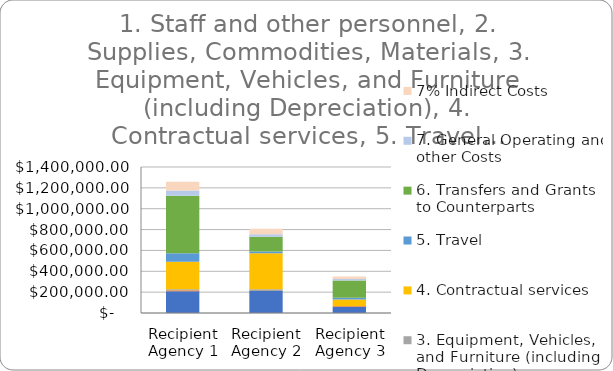
| Category | 1. Staff and other personnel | 2. Supplies, Commodities, Materials | 3. Equipment, Vehicles, and Furniture (including Depreciation) | 4. Contractual services | 5. Travel | 6. Transfers and Grants to Counterparts | 7. General Operating and other Costs |  7% Indirect Costs  |
|---|---|---|---|---|---|---|---|---|
| Recipient Agency 1 | 208000 | 10000 | 10000 | 264000.04 | 80000 | 553501.44 | 50200 | 82299.104 |
| Recipient Agency 2 | 210040 | 1800 | 16424 | 344399 | 18000 | 140000 | 24600 | 52868.41 |
| Recipient Agency 3 | 60000 | 7630.8 | 0 | 62669 | 15500 | 166303 | 15000 | 22897.196 |